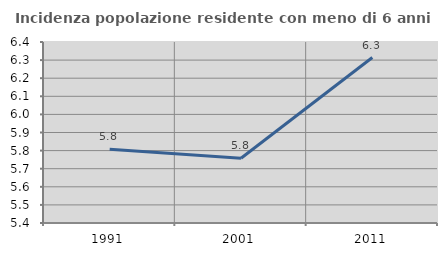
| Category | Incidenza popolazione residente con meno di 6 anni |
|---|---|
| 1991.0 | 5.807 |
| 2001.0 | 5.758 |
| 2011.0 | 6.314 |